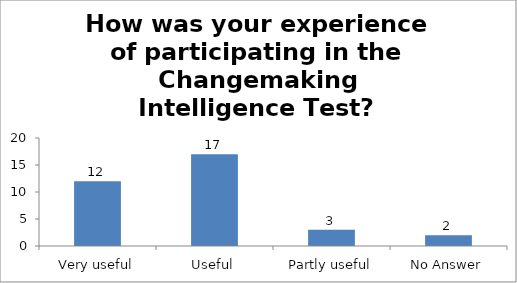
| Category | How was your experience of participating in the Changemaking Intelligence Test? |
|---|---|
| Very useful | 12 |
| Useful | 17 |
| Partly useful | 3 |
| No Answer | 2 |